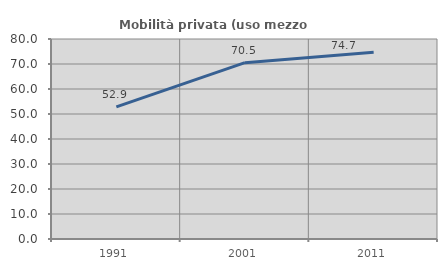
| Category | Mobilità privata (uso mezzo privato) |
|---|---|
| 1991.0 | 52.851 |
| 2001.0 | 70.525 |
| 2011.0 | 74.718 |